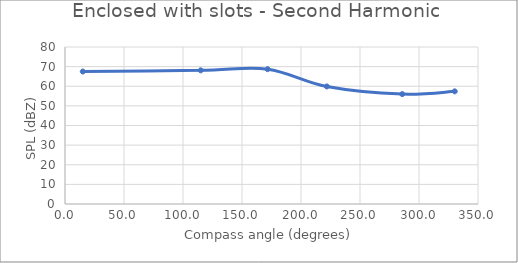
| Category | Series 0 |
|---|---|
| 15.06445125542554 | 67.5 |
| 115.00449447818254 | 68.1 |
| 171.7068171198818 | 68.7 |
| 221.8691292075067 | 59.9 |
| 285.7828166838848 | 56 |
| 330.28010595813004 | 57.4 |